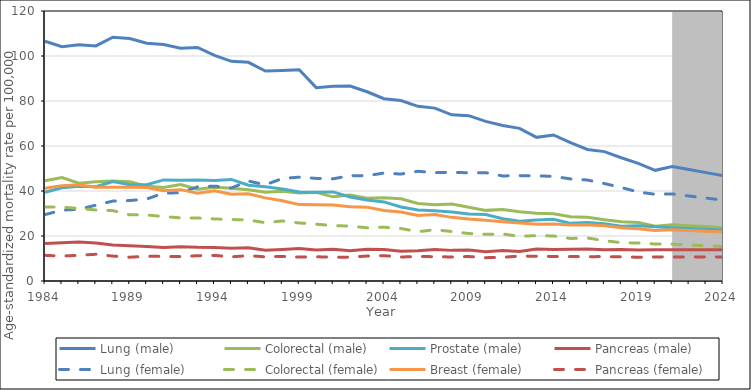
| Category | Lung (male) | Colorectal (male) | Prostate (male) | Pancreas (male) | Lung (female) | Colorectal (female) | Breast (female) | Pancreas (female) |
|---|---|---|---|---|---|---|---|---|
| 1984.0 | 106.563 | 44.587 | 39.428 | 16.705 | 29.501 | 32.88 | 41.22 | 11.407 |
| 1985.0 | 104.158 | 45.975 | 41.419 | 17.052 | 31.502 | 32.838 | 42.389 | 11.067 |
| 1986.0 | 104.986 | 43.466 | 42.135 | 17.324 | 31.854 | 32.232 | 42.739 | 11.453 |
| 1987.0 | 104.482 | 44.128 | 41.919 | 16.929 | 33.705 | 31.561 | 41.641 | 11.88 |
| 1988.0 | 108.357 | 44.471 | 44.236 | 16.019 | 35.509 | 31.285 | 41.712 | 11.066 |
| 1989.0 | 107.752 | 44.08 | 42.798 | 15.628 | 35.756 | 29.414 | 41.653 | 10.578 |
| 1990.0 | 105.674 | 42.133 | 42.833 | 15.354 | 36.445 | 29.359 | 41.598 | 10.991 |
| 1991.0 | 105.062 | 41.601 | 44.92 | 14.901 | 39.04 | 28.636 | 40.089 | 10.95 |
| 1992.0 | 103.498 | 42.911 | 44.801 | 15.262 | 39.248 | 28.056 | 40.603 | 10.843 |
| 1993.0 | 103.779 | 40.775 | 44.904 | 14.986 | 41.822 | 28.008 | 39.038 | 11.236 |
| 1994.0 | 100.308 | 41.642 | 44.642 | 14.913 | 42.167 | 27.579 | 40.132 | 11.377 |
| 1995.0 | 97.62 | 41.245 | 45.134 | 14.523 | 41.342 | 27.313 | 38.541 | 10.741 |
| 1996.0 | 97.201 | 40.564 | 42.563 | 14.787 | 44.413 | 27.131 | 38.739 | 11.268 |
| 1997.0 | 93.342 | 39.402 | 41.884 | 13.643 | 42.77 | 25.915 | 36.933 | 10.735 |
| 1998.0 | 93.593 | 39.892 | 40.939 | 14.01 | 45.543 | 26.696 | 35.697 | 10.933 |
| 1999.0 | 93.862 | 39.068 | 39.528 | 14.417 | 46.152 | 25.788 | 33.956 | 10.612 |
| 2000.0 | 85.94 | 39.383 | 39.467 | 13.726 | 45.608 | 25.243 | 33.882 | 10.762 |
| 2001.0 | 86.565 | 37.4 | 39.599 | 14.117 | 45.423 | 24.644 | 33.794 | 10.593 |
| 2002.0 | 86.649 | 38.171 | 37.321 | 13.443 | 46.831 | 24.397 | 32.998 | 10.613 |
| 2003.0 | 84.109 | 36.779 | 36.041 | 14.078 | 46.808 | 23.653 | 32.825 | 11.089 |
| 2004.0 | 80.995 | 37.049 | 35.151 | 14.034 | 47.975 | 23.913 | 31.322 | 11.259 |
| 2005.0 | 80.199 | 36.552 | 32.89 | 13.262 | 47.521 | 23.34 | 30.669 | 10.653 |
| 2006.0 | 77.633 | 34.457 | 31.564 | 13.415 | 48.753 | 21.892 | 29.131 | 10.918 |
| 2007.0 | 76.836 | 33.903 | 31.191 | 14.014 | 48.156 | 22.796 | 29.597 | 10.798 |
| 2008.0 | 73.866 | 34.223 | 30.634 | 13.612 | 48.324 | 21.988 | 28.285 | 10.686 |
| 2009.0 | 73.466 | 32.742 | 29.811 | 13.748 | 48.087 | 21.1 | 27.52 | 10.876 |
| 2010.0 | 70.958 | 31.392 | 29.554 | 12.978 | 48.16 | 20.767 | 26.998 | 10.37 |
| 2011.0 | 69.125 | 31.824 | 27.632 | 13.52 | 46.683 | 20.908 | 26.311 | 10.54 |
| 2012.0 | 67.852 | 30.764 | 26.578 | 13.124 | 46.838 | 19.822 | 25.782 | 11.09 |
| 2013.0 | 63.856 | 30.107 | 27.095 | 14.238 | 46.708 | 20.187 | 25.207 | 11.009 |
| 2014.0 | 64.888 | 29.87 | 27.411 | 14.012 | 46.525 | 20.007 | 25.305 | 10.919 |
| 2015.0 | 61.474 | 28.566 | 25.619 | 14.111 | 45.369 | 18.903 | 24.9 | 10.853 |
| 2016.0 | 58.447 | 28.3 | 26.024 | 14.212 | 44.885 | 19.129 | 25.037 | 10.818 |
| 2017.0 | 57.501 | 27.258 | 25.452 | 13.939 | 43.313 | 17.947 | 24.576 | 10.845 |
| 2018.0 | 54.764 | 26.329 | 24.381 | 14.016 | 41.555 | 17.024 | 23.699 | 10.717 |
| 2019.0 | 52.255 | 25.966 | 24.509 | 13.811 | 39.543 | 16.878 | 23.227 | 10.568 |
| 2020.0 | 49.189 | 24.322 | 24.086 | 13.932 | 38.542 | 16.442 | 22.48 | 10.701 |
| 2021.0 | 50.92 | 25.021 | 23.696 | 13.923 | 38.713 | 16.364 | 22.756 | 10.711 |
| 2022.0 | 49.522 | 24.547 | 23.364 | 13.912 | 37.786 | 16.007 | 22.41 | 10.707 |
| 2023.0 | 48.159 | 24.168 | 23.006 | 13.86 | 36.852 | 15.663 | 22.071 | 10.688 |
| 2024.0 | 46.775 | 23.69 | 22.651 | 13.866 | 35.929 | 15.33 | 21.793 | 10.705 |